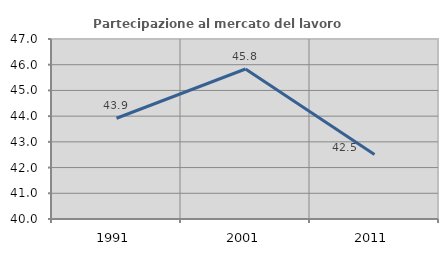
| Category | Partecipazione al mercato del lavoro  femminile |
|---|---|
| 1991.0 | 43.918 |
| 2001.0 | 45.833 |
| 2011.0 | 42.504 |